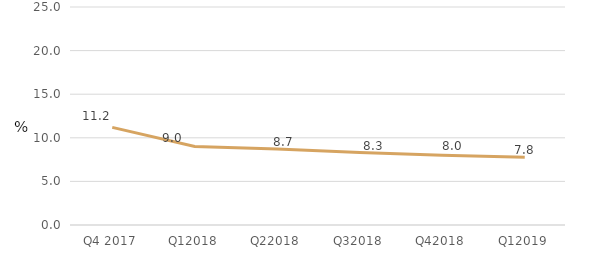
| Category | Series 0 |
|---|---|
| Q4 2017 | 11.193 |
| Q12018 | 8.995 |
| Q22018 | 8.726 |
| Q32018 | 8.32 |
| Q42018 | 8.005 |
| Q12019 | 7.764 |